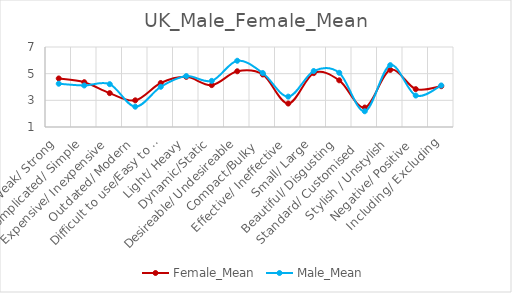
| Category | Female_Mean | Male_Mean |
|---|---|---|
| Weak/ Strong | 4.64 | 4.246 |
| Complicated/ Simple | 4.36 | 4.115 |
| Expensive/ Inexpensive | 3.54 | 4.213 |
| Outdated/ Modern | 3 | 2.525 |
| Difficult to use/Easy to use | 4.3 | 4.016 |
| Light/ Heavy | 4.76 | 4.82 |
| Dynamic/Static | 4.14 | 4.459 |
| Desireable/ Undesireable | 5.18 | 5.967 |
| Compact/Bulky  | 4.94 | 5.049 |
| Effective/ Ineffective | 2.76 | 3.279 |
| Small/ Large | 5.04 | 5.197 |
| Beautiful/ Disgusting | 4.5 | 5.066 |
| Standard/ Customised   | 2.46 | 2.18 |
| Stylish / Unstylish | 5.28 | 5.639 |
| Negative/ Positive | 3.84 | 3.361 |
| Including/ Excluding | 4.06 | 4.115 |